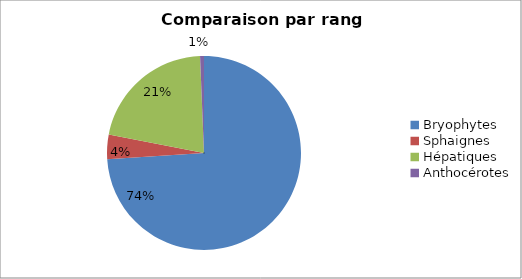
| Category | Series 0 |
|---|---|
| Bryophytes | 455 |
| Sphaignes | 25 |
| Hépatiques | 131 |
| Anthocérotes | 4 |